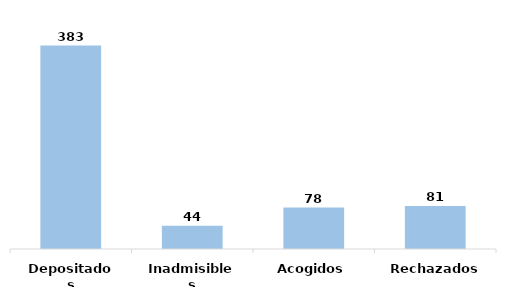
| Category | Series 0 |
|---|---|
| Depositados | 383 |
| Inadmisibles | 44 |
| Acogidos | 78 |
| Rechazados | 81 |